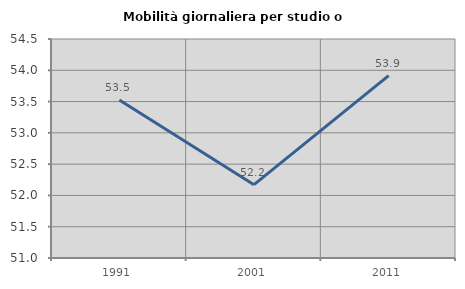
| Category | Mobilità giornaliera per studio o lavoro |
|---|---|
| 1991.0 | 53.526 |
| 2001.0 | 52.172 |
| 2011.0 | 53.915 |